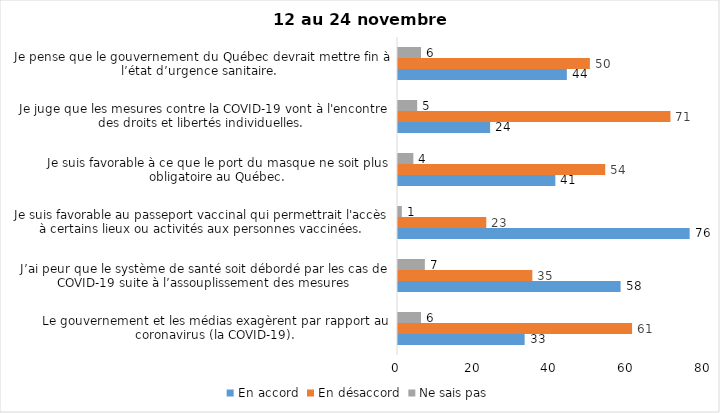
| Category | En accord | En désaccord | Ne sais pas |
|---|---|---|---|
| Le gouvernement et les médias exagèrent par rapport au coronavirus (la COVID-19). | 33 | 61 | 6 |
| J’ai peur que le système de santé soit débordé par les cas de COVID-19 suite à l’assouplissement des mesures | 58 | 35 | 7 |
| Je suis favorable au passeport vaccinal qui permettrait l'accès à certains lieux ou activités aux personnes vaccinées. | 76 | 23 | 1 |
| Je suis favorable à ce que le port du masque ne soit plus obligatoire au Québec. | 41 | 54 | 4 |
| Je juge que les mesures contre la COVID-19 vont à l'encontre des droits et libertés individuelles.  | 24 | 71 | 5 |
| Je pense que le gouvernement du Québec devrait mettre fin à l’état d’urgence sanitaire.  | 44 | 50 | 6 |